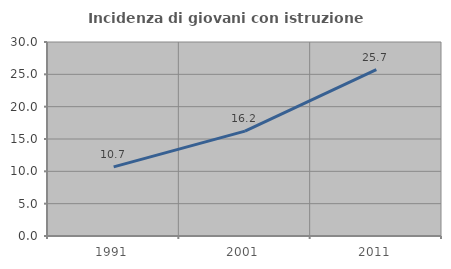
| Category | Incidenza di giovani con istruzione universitaria |
|---|---|
| 1991.0 | 10.692 |
| 2001.0 | 16.213 |
| 2011.0 | 25.73 |